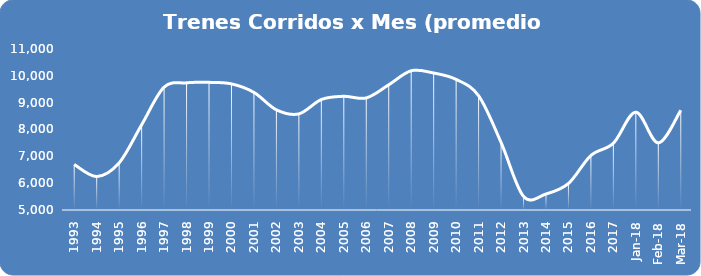
| Category | Series 0 |
|---|---|
| 1993.0 | 6696.75 |
| 1994.0 | 6247.833 |
| 1995.0 | 6757.333 |
| 1996.0 | 8174.5 |
| 1997.0 | 9578.25 |
| 1998.0 | 9738.917 |
| 1999.0 | 9756.833 |
| 2000.0 | 9700.083 |
| 2001.0 | 9382.083 |
| 2002.0 | 8732.5 |
| 2003.0 | 8581.917 |
| 2004.0 | 9117.417 |
| 2005.0 | 9236.917 |
| 2006.0 | 9176.333 |
| 2007.0 | 9665.667 |
| 2008.0 | 10189.667 |
| 2009.0 | 10105.25 |
| 2010.0 | 9866.833 |
| 2011.0 | 9259 |
| 2012.0 | 7517.667 |
| 2013.0 | 5506.833 |
| 2014.0 | 5597.25 |
| 2015.0 | 5989.083 |
| 2016.0 | 7032.167 |
| 2017.0 | 7488.917 |
| 43101.0 | 8645 |
| 43132.0 | 7501 |
| 43160.0 | 8715 |